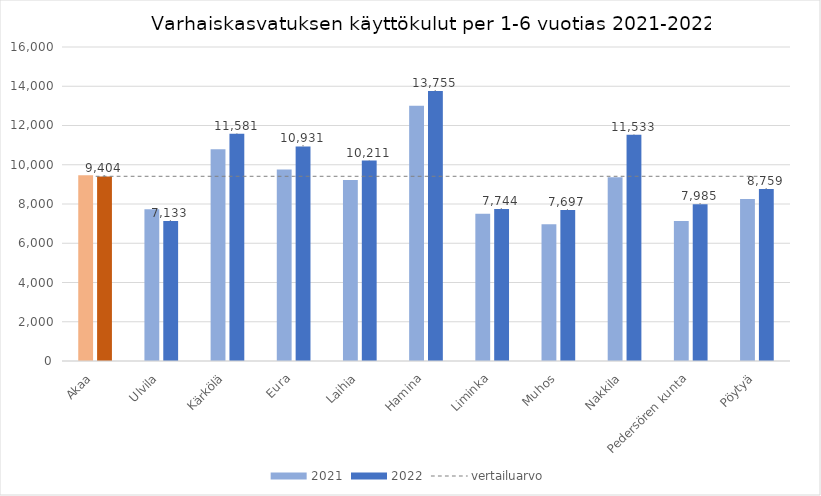
| Category | 2021 | 2022 |
|---|---|---|
| Akaa | 9463.57 | 9404.169 |
| Ulvila | 7728.702 | 7133 |
| Kärkölä | 10787.805 | 11581.213 |
| Eura | 9755.671 | 10931.422 |
| Laihia | 9222.464 | 10211.325 |
| Hamina | 13003.06 | 13755.437 |
| Liminka | 7507.023 | 7744.013 |
| Muhos | 6962.133 | 7696.87 |
| Nakkila | 9366.577 | 11532.825 |
| Pedersören kunta | 7133.883 | 7984.958 |
| Pöytyä | 8250.326 | 8759.325 |